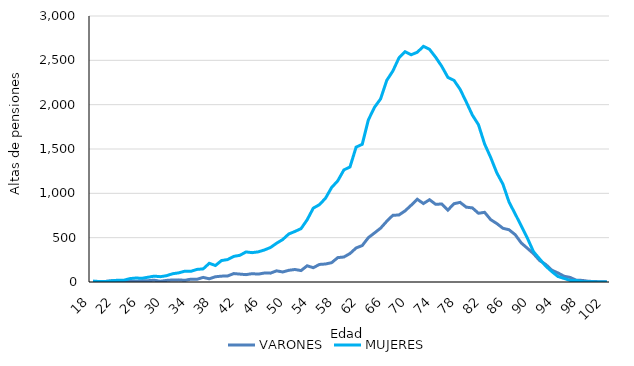
| Category | VARONES | MUJERES |
|---|---|---|
| 18.0 | 5 | 11 |
| 19.0 | 3 | 5 |
| 20.0 | 6 | 5 |
| 21.0 | 13 | 13 |
| 22.0 | 13 | 20 |
| 23.0 | 11 | 19 |
| 24.0 | 9 | 38 |
| 25.0 | 8 | 45 |
| 26.0 | 13 | 42 |
| 27.0 | 15 | 54 |
| 28.0 | 20 | 66 |
| 29.0 | 8 | 60 |
| 30.0 | 18 | 71 |
| 31.0 | 23 | 93 |
| 32.0 | 24 | 103 |
| 33.0 | 19 | 122 |
| 34.0 | 32 | 121 |
| 35.0 | 31 | 142 |
| 36.0 | 52 | 148 |
| 37.0 | 36 | 211 |
| 38.0 | 59 | 186 |
| 39.0 | 66 | 242 |
| 40.0 | 68 | 253 |
| 41.0 | 95 | 289 |
| 42.0 | 89 | 301 |
| 43.0 | 83 | 339 |
| 44.0 | 94 | 331 |
| 45.0 | 89 | 340 |
| 46.0 | 101 | 361 |
| 47.0 | 100 | 389 |
| 48.0 | 126 | 437 |
| 49.0 | 113 | 479 |
| 50.0 | 132 | 542 |
| 51.0 | 141 | 570 |
| 52.0 | 129 | 602 |
| 53.0 | 183 | 702 |
| 54.0 | 161 | 833 |
| 55.0 | 198 | 872 |
| 56.0 | 203 | 945 |
| 57.0 | 218 | 1066 |
| 58.0 | 275 | 1141 |
| 59.0 | 282 | 1264 |
| 60.0 | 321 | 1298 |
| 61.0 | 384 | 1521 |
| 62.0 | 411 | 1553 |
| 63.0 | 500 | 1828 |
| 64.0 | 553 | 1970 |
| 65.0 | 607 | 2065 |
| 66.0 | 684 | 2273 |
| 67.0 | 752 | 2379 |
| 68.0 | 756 | 2527 |
| 69.0 | 802 | 2597 |
| 70.0 | 866 | 2563 |
| 71.0 | 933 | 2591 |
| 72.0 | 885 | 2658 |
| 73.0 | 928 | 2624 |
| 74.0 | 876 | 2535 |
| 75.0 | 880 | 2432 |
| 76.0 | 811 | 2308 |
| 77.0 | 883 | 2274 |
| 78.0 | 898 | 2173 |
| 79.0 | 844 | 2031 |
| 80.0 | 836 | 1883 |
| 81.0 | 775 | 1774 |
| 82.0 | 786 | 1557 |
| 83.0 | 703 | 1404 |
| 84.0 | 659 | 1231 |
| 85.0 | 606 | 1103 |
| 86.0 | 589 | 901 |
| 87.0 | 534 | 768 |
| 88.0 | 440 | 632 |
| 89.0 | 380 | 494 |
| 90.0 | 319 | 341 |
| 91.0 | 242 | 260 |
| 92.0 | 198 | 179 |
| 93.0 | 133 | 117 |
| 94.0 | 102 | 62 |
| 95.0 | 65 | 40 |
| 96.0 | 51 | 17 |
| 97.0 | 20 | 18 |
| 98.0 | 18 | 4 |
| 99.0 | 8 | 4 |
| 100.0 | 5 | 1 |
| 101.0 | 3 | 1 |
| 102.0 | 1 | 0 |